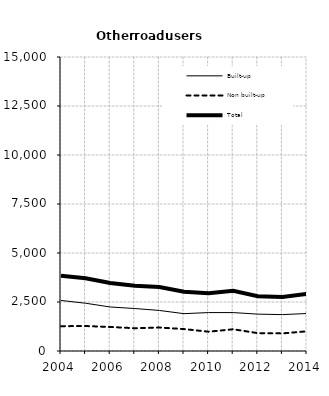
| Category | Built-up | Non built-up | Total |
|---|---|---|---|
| 2004.0 | 2579 | 1266 | 3845 |
| 2005.0 | 2437 | 1274 | 3711 |
| 2006.0 | 2246 | 1226 | 3472 |
| 2007.0 | 2167 | 1162 | 3329 |
| 2008.0 | 2068 | 1197 | 3265 |
| 2009.0 | 1905 | 1119 | 3024 |
| 2010.0 | 1961 | 985 | 2946 |
| 2011.0 | 1960 | 1109 | 3069 |
| 2012.0 | 1881 | 912 | 2793 |
| 2013.0 | 1856 | 898 | 2754 |
| 2014.0 | 1912.6 | 1004.6 | 2917.2 |